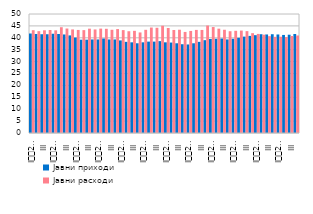
| Category | Јавни приходи  | Јавни расходи  |
|---|---|---|
| I
2007. | 41.8 | 43.2 |
| II | 41.6 | 42.792 |
| III | 41.5 | 43.161 |
| IV | 41.5 | 43.268 |
| I
2008. | 41.7 | 43.139 |
| II | 41.6 | 44.449 |
| III | 41.4 | 43.897 |
| IV | 41 | 43.511 |
| I
2009. | 40.1 | 43.301 |
| II | 39.2 | 43.223 |
| III | 39.2 | 43.838 |
| IV | 39.3 | 43.508 |
| I
2010. | 39.3 | 43.863 |
| II | 39.7 | 43.782 |
| III | 39.3 | 43.371 |
| IV | 39.3 | 43.668 |
| I
2011. | 38.9 | 43.234 |
| II | 38.3 | 42.761 |
| III | 38.1 | 42.925 |
| IV | 37.7 | 42.248 |
| I
2012. | 38.1 | 43.358 |
| II | 38.4 | 44.317 |
| III | 38.4 | 44.213 |
| IV | 38.6 | 45.073 |
| I
2013. | 38.1 | 44.124 |
| II | 38 | 43.272 |
| III | 37.7 | 43.393 |
| IV | 37.3 | 42.467 |
| I
2014. | 37.2 | 42.885 |
| II | 37.7 | 43.315 |
| III | 38.3 | 43.303 |
| IV | 39 | 45.159 |
| I
2015. | 39.5 | 44.522 |
| II | 39.6 | 43.838 |
| III | 39.7 | 43.382 |
| IV | 39.3 | 42.763 |
| I
2016. | 39.6 | 42.941 |
| II | 40 | 43.04 |
| III | 40.5 | 42.804 |
| IV | 40.8 | 41.95 |
| I
2017. | 41.1 | 41.639 |
| II | 41.5 | 41.305 |
| III | 41.4 | 40.697 |
| IV | 41.5 | 40.407 |
| I
2018. | 41.4 | 40.457 |
| II | 41.2 | 40.307 |
| III | 41.3 | 40.745 |
| IV | 41.6 | 40.972 |